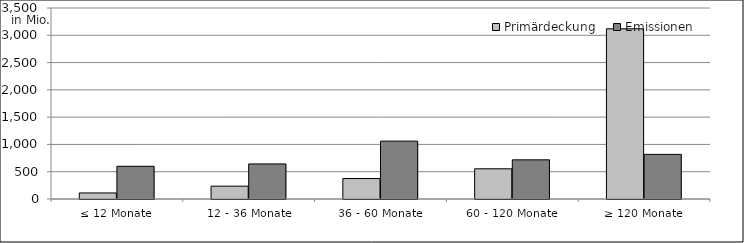
| Category | Primärdeckung | Emissionen |
|---|---|---|
| ≤ 12 Monate | 111055522.57 | 599056525.92 |
| 12 - 36 Monate | 235336769.06 | 642663906 |
| 36 - 60 Monate | 375145564.39 | 1060500000 |
| 60 - 120 Monate | 553592228.091 | 717650000 |
| ≥ 120 Monate | 3118844929.245 | 817723551.15 |